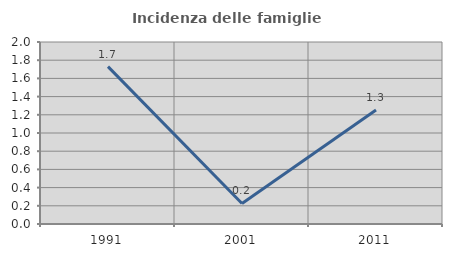
| Category | Incidenza delle famiglie numerose |
|---|---|
| 1991.0 | 1.729 |
| 2001.0 | 0.226 |
| 2011.0 | 1.252 |